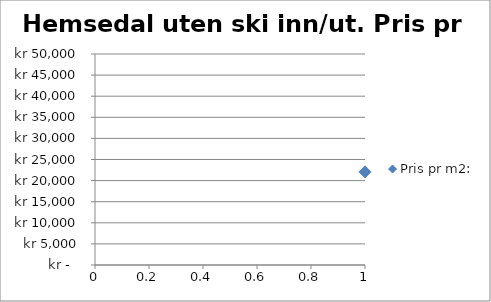
| Category | Pris pr m2: |
|---|---|
| 0 | 22075 |
| 1 | 22866 |
| 2 | 35714 |
| 3 | 20755 |
| 4 | 21610 |
| 5 | 20036 |
| 6 | 36644 |
| 7 | 37143 |
| 8 | 31429 |
| 9 | 35714 |
| 10 | 20155 |
| 11 | 29654 |
| 12 | 22866 |
| 13 | 39815 |
| 14 | 24063 |
| 15 | 21154 |
| 16 | 29654 |
| 17 | 28195 |
| 18 | 32800 |
| 19 | 38132 |
| 20 | 36179 |
| 21 | 39103 |
| 22 | 34409 |
| 23 | 30872 |
| 24 | 25806 |
| 25 | 35714 |
| 26 | 35000 |
| 27 | 24773 |
| 28 | 31746 |
| 29 | 17073 |
| 30 | 20543 |
| 31 | 21132 |
| 32 | 16575 |
| 33 | 30738 |
| 34 | 28916 |
| 35 | 28000 |
| 36 | 36098 |
| 37 | 32192 |
| 38 | 37407 |
| 39 | 39259 |
| 40 | 40476 |
| 41 | 39808 |
| 42 | 24172 |
| 43 | 30000 |
| 44 | 30000 |
| 45 | 42975 |
| 46 | 40000 |
| 47 | 27191 |
| 48 | 23438 |
| 49 | 35897 |
| 50 | 19232 |
| 51 | 22727 |
| 52 | 34211 |
| 53 | 20603 |
| 54 | 29394 |
| 55 | 14386 |
| 56 | 18750 |
| 57 | 16398 |
| 58 | 26042 |
| 59 | 20328 |
| 60 | 14828 |
| 61 | 32692 |
| 62 | 33750 |
| 63 | 15000 |
| 64 | 46914 |
| 65 | 22500 |
| 66 | 30714 |
| 67 | 19688 |
| 68 | 32115 |
| 69 | 22549 |
| 70 | 35106 |
| 71 | 27083 |
| 72 | 41270 |
| 73 | 43731 |
| 74 | 30351 |
| 75 | 32836 |
| 76 | 30147 |
| 77 | 21373 |
| 78 | 23333 |
| 79 | 28519 |
| 80 | 24773 |
| 81 | 41935 |
| 82 | 31356 |
| 83 | 25820 |
| 84 | 22464 |
| 85 | 29762 |
| 86 | 33000 |
| 87 | 16045 |
| 88 | 41491 |
| 89 | 29221 |
| 90 | 25625 |
| 91 | 26238 |
| 92 | 27957 |
| 93 | 31452 |
| 94 | 41727 |
| 95 | 33021 |
| 96 | 23729 |
| 97 | 29545 |
| 98 | 34524 |
| 99 | 26374 |
| 100 | 41837 |
| 101 | 23034 |
| 102 | 41452 |
| 103 | 32836 |